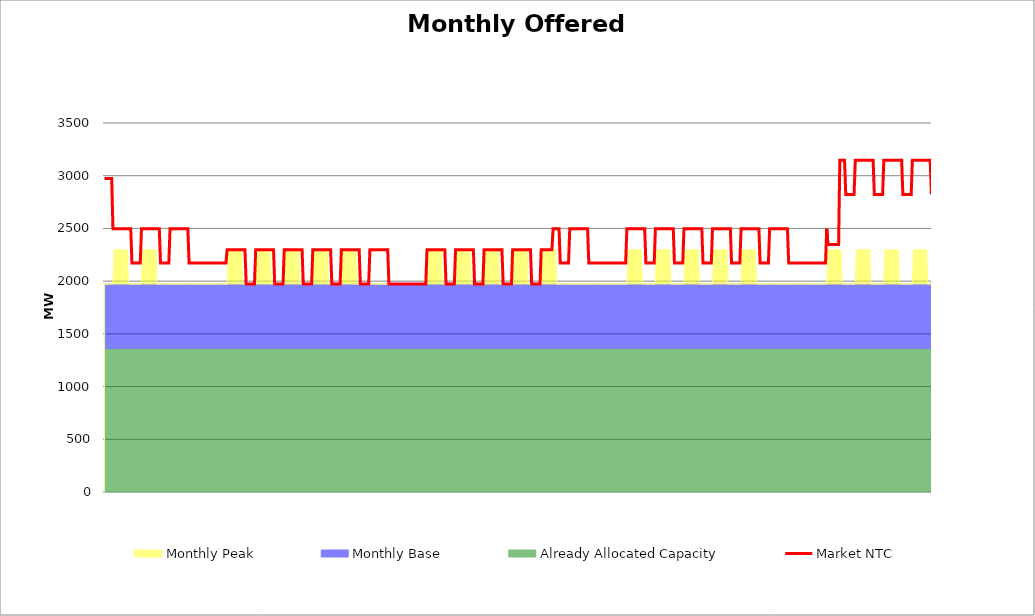
| Category | Market NTC |
|---|---|
| 0 | 2973 |
| 1 | 2973 |
| 2 | 2973 |
| 3 | 2973 |
| 4 | 2973 |
| 5 | 2973 |
| 6 | 2973 |
| 7 | 2497 |
| 8 | 2497 |
| 9 | 2497 |
| 10 | 2497 |
| 11 | 2497 |
| 12 | 2497 |
| 13 | 2497 |
| 14 | 2497 |
| 15 | 2497 |
| 16 | 2497 |
| 17 | 2497 |
| 18 | 2497 |
| 19 | 2497 |
| 20 | 2497 |
| 21 | 2497 |
| 22 | 2497 |
| 23 | 2173 |
| 24 | 2173 |
| 25 | 2173 |
| 26 | 2173 |
| 27 | 2173 |
| 28 | 2173 |
| 29 | 2173 |
| 30 | 2173 |
| 31 | 2497 |
| 32 | 2497 |
| 33 | 2497 |
| 34 | 2497 |
| 35 | 2497 |
| 36 | 2497 |
| 37 | 2497 |
| 38 | 2497 |
| 39 | 2497 |
| 40 | 2497 |
| 41 | 2497 |
| 42 | 2497 |
| 43 | 2497 |
| 44 | 2497 |
| 45 | 2497 |
| 46 | 2497 |
| 47 | 2173 |
| 48 | 2173 |
| 49 | 2173 |
| 50 | 2173 |
| 51 | 2173 |
| 52 | 2173 |
| 53 | 2173 |
| 54 | 2173 |
| 55 | 2497 |
| 56 | 2497 |
| 57 | 2497 |
| 58 | 2497 |
| 59 | 2497 |
| 60 | 2497 |
| 61 | 2497 |
| 62 | 2497 |
| 63 | 2497 |
| 64 | 2497 |
| 65 | 2497 |
| 66 | 2497 |
| 67 | 2497 |
| 68 | 2497 |
| 69 | 2497 |
| 70 | 2497 |
| 71 | 2173 |
| 72 | 2173 |
| 73 | 2173 |
| 74 | 2173 |
| 75 | 2173 |
| 76 | 2173 |
| 77 | 2173 |
| 78 | 2173 |
| 79 | 2173 |
| 80 | 2173 |
| 81 | 2173 |
| 82 | 2173 |
| 83 | 2173 |
| 84 | 2173 |
| 85 | 2173 |
| 86 | 2173 |
| 87 | 2173 |
| 88 | 2173 |
| 89 | 2173 |
| 90 | 2173 |
| 91 | 2173 |
| 92 | 2173 |
| 93 | 2173 |
| 94 | 2173 |
| 95 | 2173 |
| 96 | 2173 |
| 97 | 2173 |
| 98 | 2173 |
| 99 | 2173 |
| 100 | 2173 |
| 101 | 2173 |
| 102 | 2173 |
| 103 | 2297 |
| 104 | 2297 |
| 105 | 2297 |
| 106 | 2297 |
| 107 | 2297 |
| 108 | 2297 |
| 109 | 2297 |
| 110 | 2297 |
| 111 | 2297 |
| 112 | 2297 |
| 113 | 2297 |
| 114 | 2297 |
| 115 | 2297 |
| 116 | 2297 |
| 117 | 2297 |
| 118 | 2297 |
| 119 | 1973 |
| 120 | 1973 |
| 121 | 1973 |
| 122 | 1973 |
| 123 | 1973 |
| 124 | 1973 |
| 125 | 1973 |
| 126 | 1973 |
| 127 | 2297 |
| 128 | 2297 |
| 129 | 2297 |
| 130 | 2297 |
| 131 | 2297 |
| 132 | 2297 |
| 133 | 2297 |
| 134 | 2297 |
| 135 | 2297 |
| 136 | 2297 |
| 137 | 2297 |
| 138 | 2297 |
| 139 | 2297 |
| 140 | 2297 |
| 141 | 2297 |
| 142 | 2297 |
| 143 | 1973 |
| 144 | 1973 |
| 145 | 1973 |
| 146 | 1973 |
| 147 | 1973 |
| 148 | 1973 |
| 149 | 1973 |
| 150 | 1973 |
| 151 | 2297 |
| 152 | 2297 |
| 153 | 2297 |
| 154 | 2297 |
| 155 | 2297 |
| 156 | 2297 |
| 157 | 2297 |
| 158 | 2297 |
| 159 | 2297 |
| 160 | 2297 |
| 161 | 2297 |
| 162 | 2297 |
| 163 | 2297 |
| 164 | 2297 |
| 165 | 2297 |
| 166 | 2297 |
| 167 | 1973 |
| 168 | 1973 |
| 169 | 1973 |
| 170 | 1973 |
| 171 | 1973 |
| 172 | 1973 |
| 173 | 1973 |
| 174 | 1973 |
| 175 | 2297 |
| 176 | 2297 |
| 177 | 2297 |
| 178 | 2297 |
| 179 | 2297 |
| 180 | 2297 |
| 181 | 2297 |
| 182 | 2297 |
| 183 | 2297 |
| 184 | 2297 |
| 185 | 2297 |
| 186 | 2297 |
| 187 | 2297 |
| 188 | 2297 |
| 189 | 2297 |
| 190 | 2297 |
| 191 | 1973 |
| 192 | 1973 |
| 193 | 1973 |
| 194 | 1973 |
| 195 | 1973 |
| 196 | 1973 |
| 197 | 1973 |
| 198 | 1973 |
| 199 | 2297 |
| 200 | 2297 |
| 201 | 2297 |
| 202 | 2297 |
| 203 | 2297 |
| 204 | 2297 |
| 205 | 2297 |
| 206 | 2297 |
| 207 | 2297 |
| 208 | 2297 |
| 209 | 2297 |
| 210 | 2297 |
| 211 | 2297 |
| 212 | 2297 |
| 213 | 2297 |
| 214 | 2297 |
| 215 | 1973 |
| 216 | 1973 |
| 217 | 1973 |
| 218 | 1973 |
| 219 | 1973 |
| 220 | 1973 |
| 221 | 1973 |
| 222 | 1973 |
| 223 | 2297 |
| 224 | 2297 |
| 225 | 2297 |
| 226 | 2297 |
| 227 | 2297 |
| 228 | 2297 |
| 229 | 2297 |
| 230 | 2297 |
| 231 | 2297 |
| 232 | 2297 |
| 233 | 2297 |
| 234 | 2297 |
| 235 | 2297 |
| 236 | 2297 |
| 237 | 2297 |
| 238 | 2297 |
| 239 | 1973 |
| 240 | 1973 |
| 241 | 1973 |
| 242 | 1973 |
| 243 | 1973 |
| 244 | 1973 |
| 245 | 1973 |
| 246 | 1973 |
| 247 | 1973 |
| 248 | 1973 |
| 249 | 1973 |
| 250 | 1973 |
| 251 | 1973 |
| 252 | 1973 |
| 253 | 1973 |
| 254 | 1973 |
| 255 | 1973 |
| 256 | 1973 |
| 257 | 1973 |
| 258 | 1973 |
| 259 | 1973 |
| 260 | 1973 |
| 261 | 1973 |
| 262 | 1973 |
| 263 | 1973 |
| 264 | 1973 |
| 265 | 1973 |
| 266 | 1973 |
| 267 | 1973 |
| 268 | 1973 |
| 269 | 1973 |
| 270 | 1973 |
| 271 | 2297 |
| 272 | 2297 |
| 273 | 2297 |
| 274 | 2297 |
| 275 | 2297 |
| 276 | 2297 |
| 277 | 2297 |
| 278 | 2297 |
| 279 | 2297 |
| 280 | 2297 |
| 281 | 2297 |
| 282 | 2297 |
| 283 | 2297 |
| 284 | 2297 |
| 285 | 2297 |
| 286 | 2297 |
| 287 | 1973 |
| 288 | 1973 |
| 289 | 1973 |
| 290 | 1973 |
| 291 | 1973 |
| 292 | 1973 |
| 293 | 1973 |
| 294 | 1973 |
| 295 | 2297 |
| 296 | 2297 |
| 297 | 2297 |
| 298 | 2297 |
| 299 | 2297 |
| 300 | 2297 |
| 301 | 2297 |
| 302 | 2297 |
| 303 | 2297 |
| 304 | 2297 |
| 305 | 2297 |
| 306 | 2297 |
| 307 | 2297 |
| 308 | 2297 |
| 309 | 2297 |
| 310 | 2297 |
| 311 | 1973 |
| 312 | 1973 |
| 313 | 1973 |
| 314 | 1973 |
| 315 | 1973 |
| 316 | 1973 |
| 317 | 1973 |
| 318 | 1973 |
| 319 | 2297 |
| 320 | 2297 |
| 321 | 2297 |
| 322 | 2297 |
| 323 | 2297 |
| 324 | 2297 |
| 325 | 2297 |
| 326 | 2297 |
| 327 | 2297 |
| 328 | 2297 |
| 329 | 2297 |
| 330 | 2297 |
| 331 | 2297 |
| 332 | 2297 |
| 333 | 2297 |
| 334 | 2297 |
| 335 | 1973 |
| 336 | 1973 |
| 337 | 1973 |
| 338 | 1973 |
| 339 | 1973 |
| 340 | 1973 |
| 341 | 1973 |
| 342 | 1973 |
| 343 | 2297 |
| 344 | 2297 |
| 345 | 2297 |
| 346 | 2297 |
| 347 | 2297 |
| 348 | 2297 |
| 349 | 2297 |
| 350 | 2297 |
| 351 | 2297 |
| 352 | 2297 |
| 353 | 2297 |
| 354 | 2297 |
| 355 | 2297 |
| 356 | 2297 |
| 357 | 2297 |
| 358 | 2297 |
| 359 | 1973 |
| 360 | 1973 |
| 361 | 1973 |
| 362 | 1973 |
| 363 | 1973 |
| 364 | 1973 |
| 365 | 1973 |
| 366 | 1973 |
| 367 | 2297 |
| 368 | 2297 |
| 369 | 2297 |
| 370 | 2297 |
| 371 | 2297 |
| 372 | 2297 |
| 373 | 2297 |
| 374 | 2297 |
| 375 | 2297 |
| 376 | 2297 |
| 377 | 2497 |
| 378 | 2497 |
| 379 | 2497 |
| 380 | 2497 |
| 381 | 2497 |
| 382 | 2497 |
| 383 | 2173 |
| 384 | 2173 |
| 385 | 2173 |
| 386 | 2173 |
| 387 | 2173 |
| 388 | 2173 |
| 389 | 2173 |
| 390 | 2173 |
| 391 | 2497 |
| 392 | 2497 |
| 393 | 2497 |
| 394 | 2497 |
| 395 | 2497 |
| 396 | 2497 |
| 397 | 2497 |
| 398 | 2497 |
| 399 | 2497 |
| 400 | 2497 |
| 401 | 2497 |
| 402 | 2497 |
| 403 | 2497 |
| 404 | 2497 |
| 405 | 2497 |
| 406 | 2497 |
| 407 | 2173 |
| 408 | 2173 |
| 409 | 2173 |
| 410 | 2173 |
| 411 | 2173 |
| 412 | 2173 |
| 413 | 2173 |
| 414 | 2173 |
| 415 | 2173 |
| 416 | 2173 |
| 417 | 2173 |
| 418 | 2173 |
| 419 | 2173 |
| 420 | 2173 |
| 421 | 2173 |
| 422 | 2173 |
| 423 | 2173 |
| 424 | 2173 |
| 425 | 2173 |
| 426 | 2173 |
| 427 | 2173 |
| 428 | 2173 |
| 429 | 2173 |
| 430 | 2173 |
| 431 | 2173 |
| 432 | 2173 |
| 433 | 2173 |
| 434 | 2173 |
| 435 | 2173 |
| 436 | 2173 |
| 437 | 2173 |
| 438 | 2173 |
| 439 | 2497 |
| 440 | 2497 |
| 441 | 2497 |
| 442 | 2497 |
| 443 | 2497 |
| 444 | 2497 |
| 445 | 2497 |
| 446 | 2497 |
| 447 | 2497 |
| 448 | 2497 |
| 449 | 2497 |
| 450 | 2497 |
| 451 | 2497 |
| 452 | 2497 |
| 453 | 2497 |
| 454 | 2497 |
| 455 | 2173 |
| 456 | 2173 |
| 457 | 2173 |
| 458 | 2173 |
| 459 | 2173 |
| 460 | 2173 |
| 461 | 2173 |
| 462 | 2173 |
| 463 | 2497 |
| 464 | 2497 |
| 465 | 2497 |
| 466 | 2497 |
| 467 | 2497 |
| 468 | 2497 |
| 469 | 2497 |
| 470 | 2497 |
| 471 | 2497 |
| 472 | 2497 |
| 473 | 2497 |
| 474 | 2497 |
| 475 | 2497 |
| 476 | 2497 |
| 477 | 2497 |
| 478 | 2497 |
| 479 | 2173 |
| 480 | 2173 |
| 481 | 2173 |
| 482 | 2173 |
| 483 | 2173 |
| 484 | 2173 |
| 485 | 2173 |
| 486 | 2173 |
| 487 | 2497 |
| 488 | 2497 |
| 489 | 2497 |
| 490 | 2497 |
| 491 | 2497 |
| 492 | 2497 |
| 493 | 2497 |
| 494 | 2497 |
| 495 | 2497 |
| 496 | 2497 |
| 497 | 2497 |
| 498 | 2497 |
| 499 | 2497 |
| 500 | 2497 |
| 501 | 2497 |
| 502 | 2497 |
| 503 | 2173 |
| 504 | 2173 |
| 505 | 2173 |
| 506 | 2173 |
| 507 | 2173 |
| 508 | 2173 |
| 509 | 2173 |
| 510 | 2173 |
| 511 | 2497 |
| 512 | 2497 |
| 513 | 2497 |
| 514 | 2497 |
| 515 | 2497 |
| 516 | 2497 |
| 517 | 2497 |
| 518 | 2497 |
| 519 | 2497 |
| 520 | 2497 |
| 521 | 2497 |
| 522 | 2497 |
| 523 | 2497 |
| 524 | 2497 |
| 525 | 2497 |
| 526 | 2497 |
| 527 | 2173 |
| 528 | 2173 |
| 529 | 2173 |
| 530 | 2173 |
| 531 | 2173 |
| 532 | 2173 |
| 533 | 2173 |
| 534 | 2173 |
| 535 | 2497 |
| 536 | 2497 |
| 537 | 2497 |
| 538 | 2497 |
| 539 | 2497 |
| 540 | 2497 |
| 541 | 2497 |
| 542 | 2497 |
| 543 | 2497 |
| 544 | 2497 |
| 545 | 2497 |
| 546 | 2497 |
| 547 | 2497 |
| 548 | 2497 |
| 549 | 2497 |
| 550 | 2497 |
| 551 | 2173 |
| 552 | 2173 |
| 553 | 2173 |
| 554 | 2173 |
| 555 | 2173 |
| 556 | 2173 |
| 557 | 2173 |
| 558 | 2173 |
| 559 | 2497 |
| 560 | 2497 |
| 561 | 2497 |
| 562 | 2497 |
| 563 | 2497 |
| 564 | 2497 |
| 565 | 2497 |
| 566 | 2497 |
| 567 | 2497 |
| 568 | 2497 |
| 569 | 2497 |
| 570 | 2497 |
| 571 | 2497 |
| 572 | 2497 |
| 573 | 2497 |
| 574 | 2497 |
| 575 | 2173 |
| 576 | 2173 |
| 577 | 2173 |
| 578 | 2173 |
| 579 | 2173 |
| 580 | 2173 |
| 581 | 2173 |
| 582 | 2173 |
| 583 | 2173 |
| 584 | 2173 |
| 585 | 2173 |
| 586 | 2173 |
| 587 | 2173 |
| 588 | 2173 |
| 589 | 2173 |
| 590 | 2173 |
| 591 | 2173 |
| 592 | 2173 |
| 593 | 2173 |
| 594 | 2173 |
| 595 | 2173 |
| 596 | 2173 |
| 597 | 2173 |
| 598 | 2173 |
| 599 | 2173 |
| 600 | 2173 |
| 601 | 2173 |
| 602 | 2173 |
| 603 | 2173 |
| 604 | 2173 |
| 605 | 2173 |
| 606 | 2173 |
| 607 | 2497 |
| 608 | 2347 |
| 609 | 2347 |
| 610 | 2347 |
| 611 | 2347 |
| 612 | 2347 |
| 613 | 2347 |
| 614 | 2347 |
| 615 | 2347 |
| 616 | 2347 |
| 617 | 2347 |
| 618 | 3147 |
| 619 | 3147 |
| 620 | 3147 |
| 621 | 3147 |
| 622 | 3147 |
| 623 | 2823 |
| 624 | 2823 |
| 625 | 2823 |
| 626 | 2823 |
| 627 | 2823 |
| 628 | 2823 |
| 629 | 2823 |
| 630 | 2823 |
| 631 | 3147 |
| 632 | 3147 |
| 633 | 3147 |
| 634 | 3147 |
| 635 | 3147 |
| 636 | 3147 |
| 637 | 3147 |
| 638 | 3147 |
| 639 | 3147 |
| 640 | 3147 |
| 641 | 3147 |
| 642 | 3147 |
| 643 | 3147 |
| 644 | 3147 |
| 645 | 3147 |
| 646 | 3147 |
| 647 | 2823 |
| 648 | 2823 |
| 649 | 2823 |
| 650 | 2823 |
| 651 | 2823 |
| 652 | 2823 |
| 653 | 2823 |
| 654 | 2823 |
| 655 | 3147 |
| 656 | 3147 |
| 657 | 3147 |
| 658 | 3147 |
| 659 | 3147 |
| 660 | 3147 |
| 661 | 3147 |
| 662 | 3147 |
| 663 | 3147 |
| 664 | 3147 |
| 665 | 3147 |
| 666 | 3147 |
| 667 | 3147 |
| 668 | 3147 |
| 669 | 3147 |
| 670 | 3147 |
| 671 | 2823 |
| 672 | 2823 |
| 673 | 2823 |
| 674 | 2823 |
| 675 | 2823 |
| 676 | 2823 |
| 677 | 2823 |
| 678 | 2823 |
| 679 | 3147 |
| 680 | 3147 |
| 681 | 3147 |
| 682 | 3147 |
| 683 | 3147 |
| 684 | 3147 |
| 685 | 3147 |
| 686 | 3147 |
| 687 | 3147 |
| 688 | 3147 |
| 689 | 3147 |
| 690 | 3147 |
| 691 | 3147 |
| 692 | 3147 |
| 693 | 3147 |
| 694 | 3147 |
| 695 | 2823 |